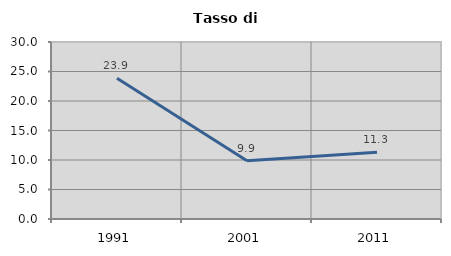
| Category | Tasso di disoccupazione   |
|---|---|
| 1991.0 | 23.864 |
| 2001.0 | 9.877 |
| 2011.0 | 11.314 |